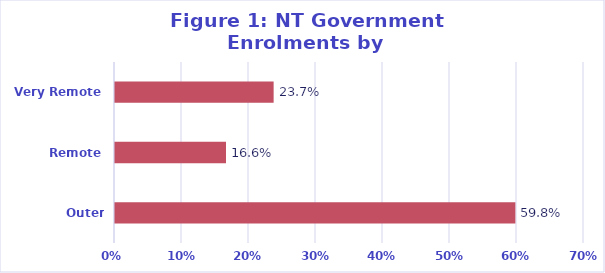
| Category | % |
|---|---|
| Outer Regional | 0.598 |
| Remote | 0.166 |
| Very Remote | 0.237 |